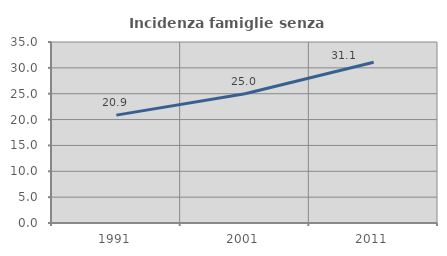
| Category | Incidenza famiglie senza nuclei |
|---|---|
| 1991.0 | 20.859 |
| 2001.0 | 25 |
| 2011.0 | 31.098 |